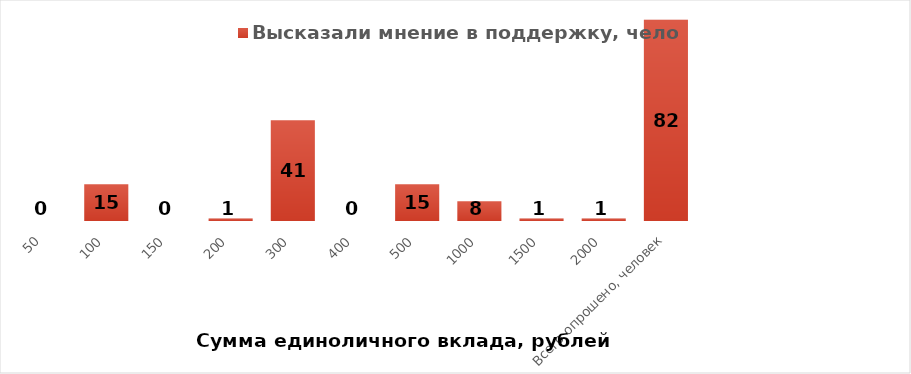
| Category | Высказали мнение в поддержку, человек |
|---|---|
| 50 | 0 |
| 100 | 15 |
| 150 | 0 |
| 200 | 1 |
| 300 | 41 |
| 400 | 0 |
| 500 | 15 |
| 1000 | 8 |
| 1500 | 1 |
| 2000 | 1 |
| Всего опрошено, человек | 82 |